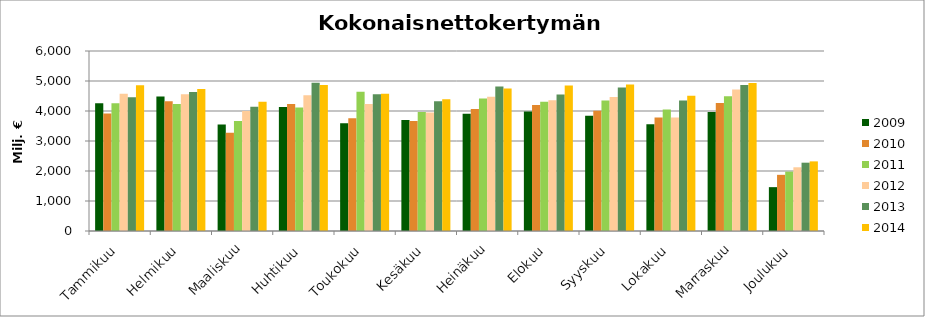
| Category | 2009 | 2010 | 2011 | 2012 | 2013 | 2014 |
|---|---|---|---|---|---|---|
| Tammikuu | 4262.104 | 3920.596 | 4254.457 | 4574.273 | 4458.574 | 4859.611 |
| Helmikuu | 4482.61 | 4324.273 | 4236.531 | 4556.683 | 4631.184 | 4733.214 |
| Maaliskuu | 3551.222 | 3273.1 | 3667.911 | 4003.705 | 4141.995 | 4307.275 |
| Huhtikuu | 4137.11 | 4235.283 | 4118.677 | 4521.853 | 4938.018 | 4869.346 |
| Toukokuu | 3589.232 | 3758.246 | 4645.002 | 4229.781 | 4554.199 | 4573.181 |
| Kesäkuu | 3701.617 | 3667.134 | 3966.073 | 3950.962 | 4320.908 | 4392.249 |
| Heinäkuu | 3908.058 | 4070.751 | 4417.867 | 4473.488 | 4813.288 | 4746.187 |
| Elokuu | 3983.999 | 4202.024 | 4310.334 | 4361.243 | 4548.338 | 4849.507 |
| Syyskuu | 3843.197 | 4009.059 | 4353.55 | 4465.954 | 4780.078 | 4883.402 |
| Lokakuu | 3558.554 | 3781.91 | 4052.329 | 3783.435 | 4353.533 | 4510.318 |
| Marraskuu | 3964.456 | 4269.91 | 4491.275 | 4716.744 | 4864.184 | 4933.92 |
| Joulukuu | 1461.632 | 1872.231 | 1978.993 | 2124.114 | 2277.179 | 2320.819 |